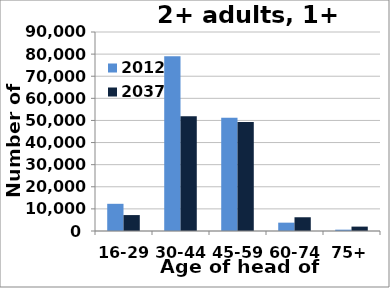
| Category | 2012 | 2037 |
|---|---|---|
| 16-29 | 12298 | 7204 |
| 30-44 | 79017 | 51849 |
| 45-59 | 51234 | 49301 |
| 60-74 | 3774 | 6215 |
| 75+ | 603 | 1986 |